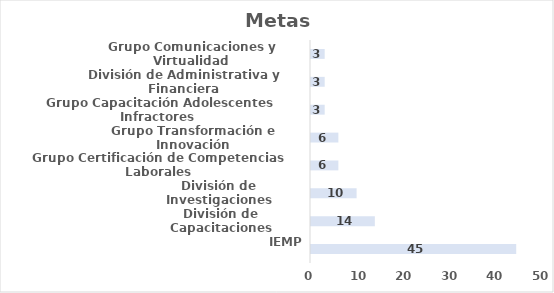
| Category | Metas |
|---|---|
| IEMP | 45 |
| División de Capacitaciones | 14 |
| División de Investigaciones | 10 |
| Grupo Certificación de Competencias Laborales | 6 |
| Grupo Transformación e Innovación | 6 |
| Grupo Capacitación Adolescentes Infractores 
(No se ejecuta) | 3 |
| División de Administrativa y Financiera | 3 |
| Grupo Comunicaciones y Virtualidad | 3 |